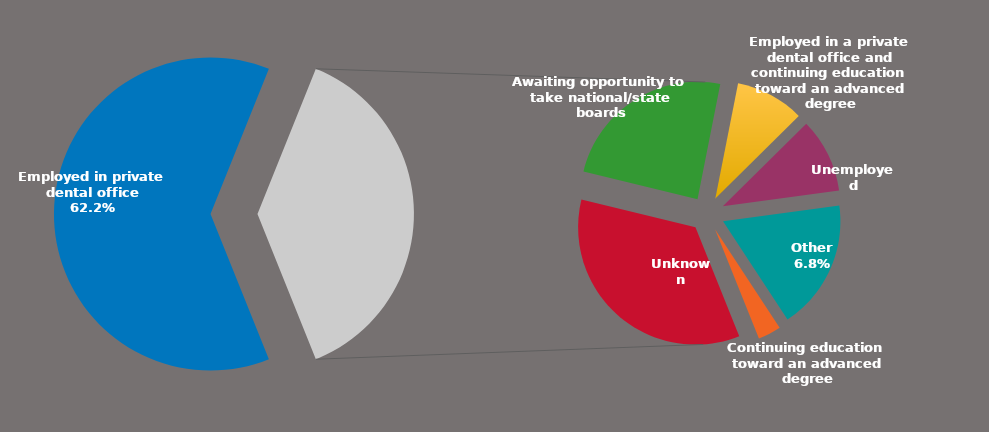
| Category | Series 0 |
|---|---|
| Employed in private dental office | 0.622 |
| Unknown | 0.132 |
| Awaiting opportunity to take national/state boards | 0.092 |
| Employed in a private dental office and continuing education toward an advanced degree | 0.036 |
| Unemployed | 0.039 |
| Other | 0.068 |
| Continuing education toward an advanced degree | 0.012 |